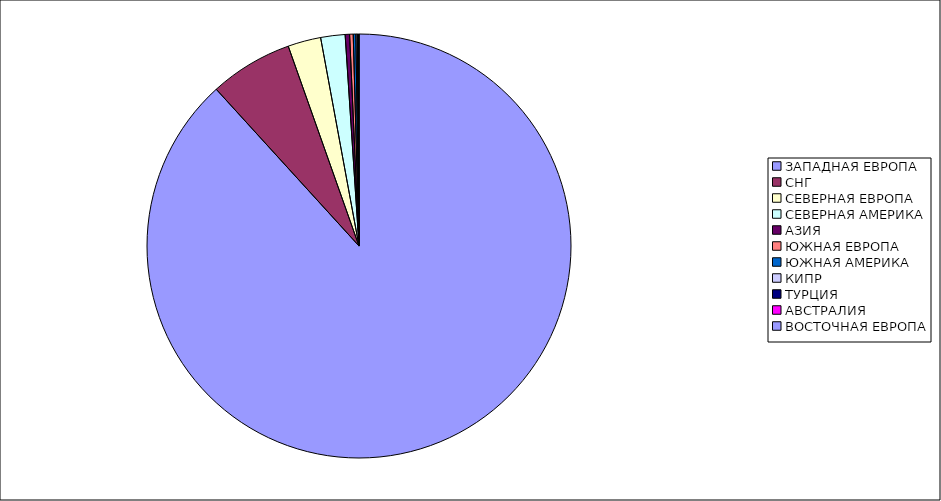
| Category | Оборот |
|---|---|
| ЗАПАДНАЯ ЕВРОПА | 0.882 |
| СНГ | 0.063 |
| СЕВЕРНАЯ ЕВРОПА | 0.025 |
| СЕВЕРНАЯ АМЕРИКА | 0.019 |
| АЗИЯ | 0.003 |
| ЮЖНАЯ ЕВРОПА | 0.003 |
| ЮЖНАЯ АМЕРИКА | 0.002 |
| КИПР | 0.001 |
| ТУРЦИЯ | 0.001 |
| АВСТРАЛИЯ | 0 |
| ВОСТОЧНАЯ ЕВРОПА | 0 |